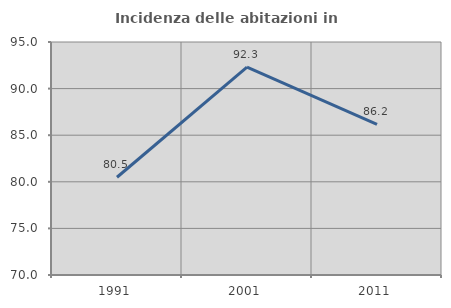
| Category | Incidenza delle abitazioni in proprietà  |
|---|---|
| 1991.0 | 80.488 |
| 2001.0 | 92.308 |
| 2011.0 | 86.17 |